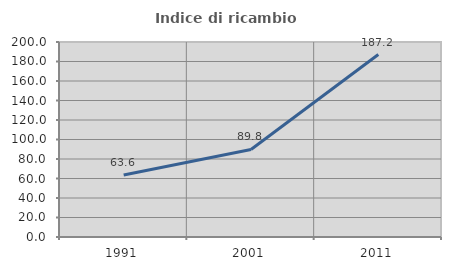
| Category | Indice di ricambio occupazionale  |
|---|---|
| 1991.0 | 63.565 |
| 2001.0 | 89.775 |
| 2011.0 | 187.177 |